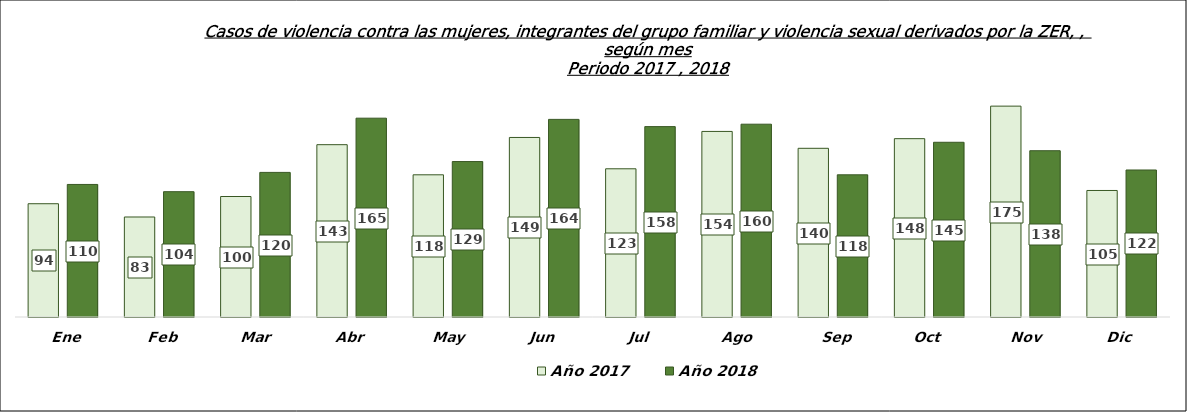
| Category | Año 2017 | Año 2018 |
|---|---|---|
| Ene | 94 | 110 |
| Feb | 83 | 104 |
| Mar | 100 | 120 |
| Abr | 143 | 165 |
| May | 118 | 129 |
| Jun | 149 | 164 |
| Jul | 123 | 158 |
| Ago | 154 | 160 |
| Sep | 140 | 118 |
| Oct | 148 | 145 |
| Nov | 175 | 138 |
| Dic | 105 | 122 |